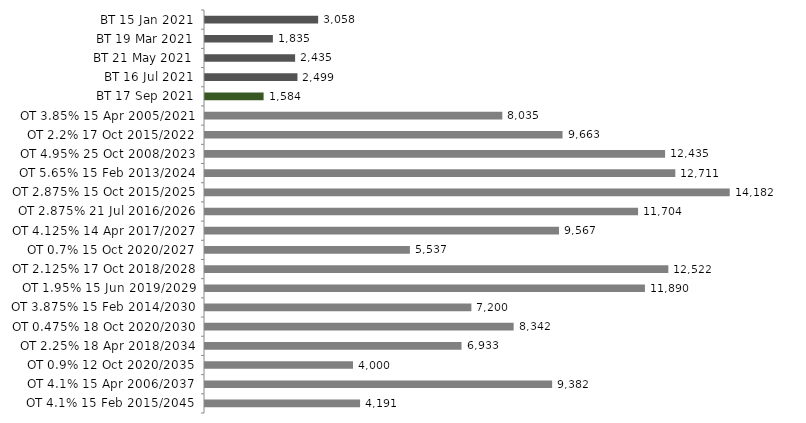
| Category | Series 0 |
|---|---|
| BT 15 Jan 2021 | 3057.867 |
| BT 19 Mar 2021 | 1834.5 |
| BT 21 May 2021 | 2435.353 |
| BT 16 Jul 2021 | 2498.642 |
| BT 17 Sep 2021 | 1583.759 |
| OT 3.85% 15 Apr 2005/2021 | 8034.958 |
| OT 2.2% 17 Oct 2015/2022 | 9663.262 |
| OT 4.95% 25 Oct 2008/2023 | 12434.734 |
| OT 5.65% 15 Feb 2013/2024 | 12711.355 |
| OT 2.875% 15 Oct 2015/2025 | 14181.75 |
| OT 2.875% 21 Jul 2016/2026 | 11703.946 |
| OT 4.125% 14 Apr 2017/2027 | 9566.841 |
| OT 0.7% 15 Oct 2020/2027 | 5537.428 |
| OT 2.125% 17 Oct 2018/2028 | 12522.387 |
| OT 1.95% 15 Jun 2019/2029 | 11889.72 |
| OT 3.875% 15 Feb 2014/2030 | 7199.513 |
| OT 0.475% 18 Oct 2020/2030 | 8341.933 |
| OT 2.25% 18 Apr 2018/2034 | 6932.895 |
| OT 0.9% 12 Oct 2020/2035 | 4000 |
| OT 4.1% 15 Apr 2006/2037 | 9382.174 |
| OT 4.1% 15 Feb 2015/2045 | 4191.316 |